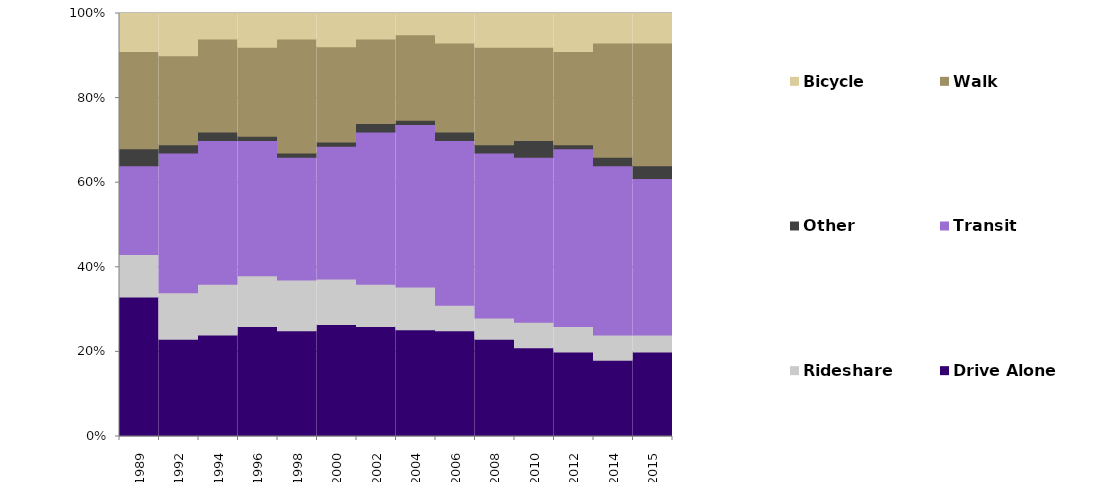
| Category | Drive Alone | Rideshare | Transit | Other | Walk | Bicycle |
|---|---|---|---|---|---|---|
| 1989.0 | 33 | 10 | 21 | 4 | 23 | 9 |
| 1992.0 | 23 | 11 | 33 | 2 | 21 | 10 |
| 1994.0 | 24 | 12 | 34 | 2 | 22 | 6 |
| 1996.0 | 26 | 12 | 32 | 1 | 21 | 8 |
| 1998.0 | 25 | 12 | 29 | 1 | 27 | 6 |
| 2000.0 | 27 | 11 | 32 | 1 | 23 | 8 |
| 2002.0 | 26 | 10 | 36 | 2 | 20 | 6 |
| 2004.0 | 25 | 10 | 38 | 1 | 20 | 5 |
| 2006.0 | 25 | 6 | 39 | 2 | 21 | 7 |
| 2008.0 | 23 | 5 | 39 | 2 | 23 | 8 |
| 2010.0 | 21 | 6 | 39 | 4 | 22 | 8 |
| 2012.0 | 20 | 6 | 42 | 1 | 22 | 9 |
| 2014.0 | 18 | 6 | 40 | 2 | 27 | 7 |
| 2015.0 | 20 | 4 | 37 | 3 | 29 | 7 |